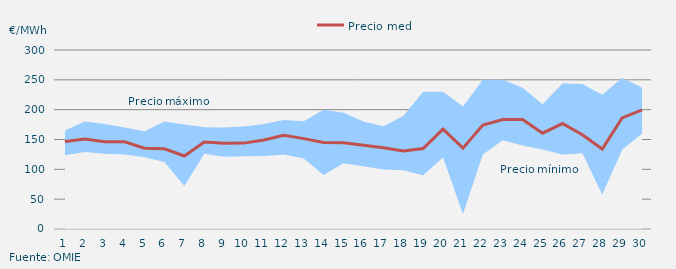
| Category | Precio medio |
|---|---|
| 1.0 | 146.689 |
| 2.0 | 150.72 |
| 3.0 | 146.378 |
| 4.0 | 146.133 |
| 5.0 | 135.35 |
| 6.0 | 134.405 |
| 7.0 | 122.38 |
| 8.0 | 145.748 |
| 9.0 | 143.581 |
| 10.0 | 143.954 |
| 11.0 | 149.221 |
| 12.0 | 157.029 |
| 13.0 | 151.5 |
| 14.0 | 144.96 |
| 15.0 | 144.416 |
| 16.0 | 140.428 |
| 17.0 | 136.127 |
| 18.0 | 130.691 |
| 19.0 | 134.816 |
| 20.0 | 167.279 |
| 21.0 | 135.517 |
| 22.0 | 174.274 |
| 23.0 | 183.434 |
| 24.0 | 183.368 |
| 25.0 | 160.596 |
| 26.0 | 176.75 |
| 27.0 | 157.846 |
| 28.0 | 134.037 |
| 29.0 | 186.08 |
| 30.0 | 199.536 |